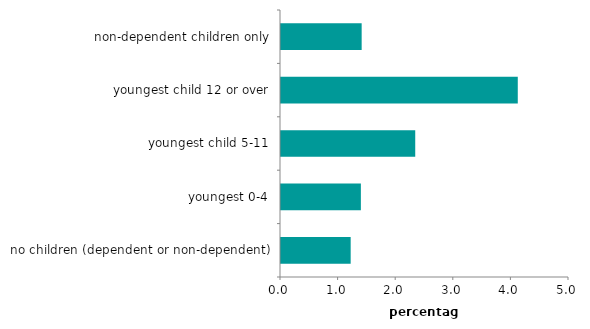
| Category | Series 6 |
|---|---|
| no children (dependent or non-dependent) | 1.21 |
| youngest 0-4 | 1.387 |
| youngest child 5-11 | 2.331 |
| youngest child 12 or over | 4.111 |
| non-dependent children only | 1.4 |